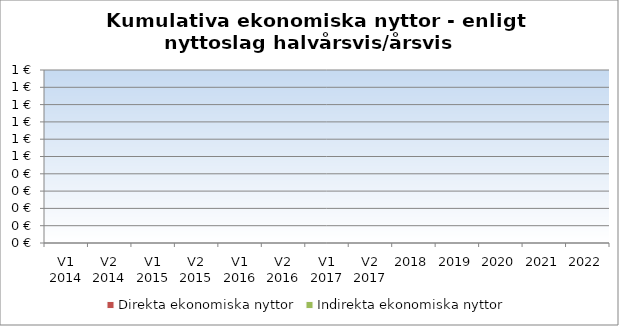
| Category | Direkta ekonomiska nyttor | Indirekta ekonomiska nyttor |
|---|---|---|
| V1 2014 | 0 | 0 |
| V2 2014 | 0 | 0 |
| V1 2015 | 0 | 0 |
| V2 2015 | 0 | 0 |
| V1 2016 | 0 | 0 |
| V2 2016 | 0 | 0 |
| V1 2017 | 0 | 0 |
| V2 2017 | 0 | 0 |
| 2018 | 0 | 0 |
| 2019 | 0 | 0 |
| 2020 | 0 | 0 |
| 2021 | 0 | 0 |
| 2022 | 0 | 0 |